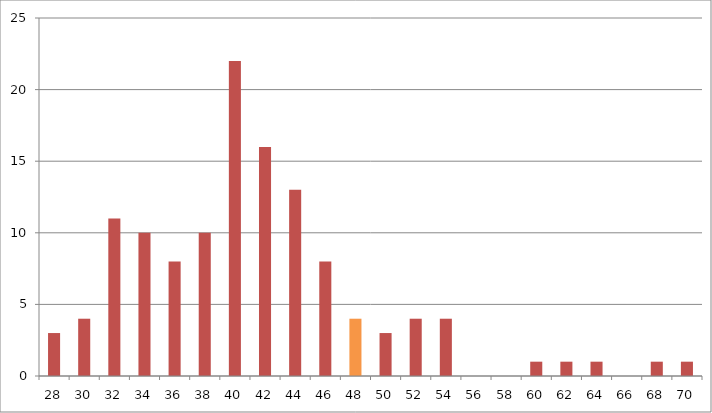
| Category | Series 1 |
|---|---|
| 28.0 | 3 |
| 30.0 | 4 |
| 32.0 | 11 |
| 34.0 | 10 |
| 36.0 | 8 |
| 38.0 | 10 |
| 40.0 | 22 |
| 42.0 | 16 |
| 44.0 | 13 |
| 46.0 | 8 |
| 48.0 | 4 |
| 50.0 | 3 |
| 52.0 | 4 |
| 54.0 | 4 |
| 56.0 | 0 |
| 58.0 | 0 |
| 60.0 | 1 |
| 62.0 | 1 |
| 64.0 | 1 |
| 66.0 | 0 |
| 68.0 | 1 |
| 70.0 | 1 |